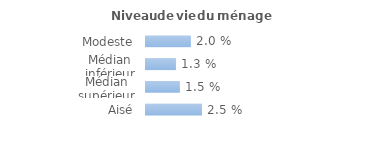
| Category | Series 0 |
|---|---|
| Modeste | 0.02 |
| Médian inférieur | 0.013 |
| Médian supérieur | 0.015 |
| Aisé | 0.025 |